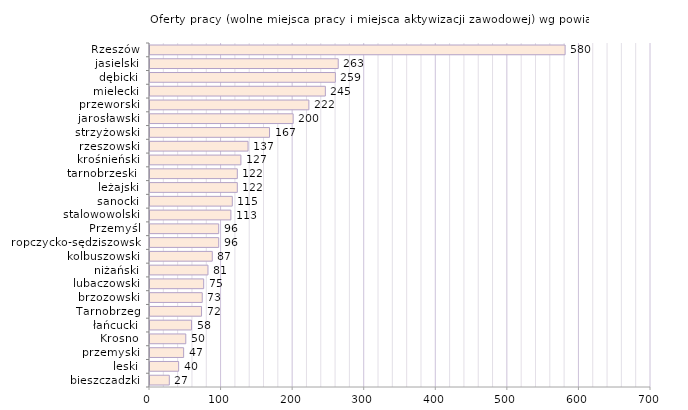
| Category | Oferty pracy (wolne miejsca pracy i miejsca aktywizacji zawodowej) wg powiatów |
|---|---|
| bieszczadzki | 27 |
| leski | 40 |
| przemyski | 47 |
| Krosno | 50 |
| łańcucki | 58 |
| Tarnobrzeg | 72 |
| brzozowski | 73 |
| lubaczowski | 75 |
| niżański | 81 |
| kolbuszowski | 87 |
| ropczycko-sędziszowski | 96 |
| Przemyśl | 96 |
| stalowowolski | 113 |
| sanocki | 115 |
| leżajski | 122 |
| tarnobrzeski  | 122 |
| krośnieński | 127 |
| rzeszowski | 137 |
| strzyżowski | 167 |
| jarosławski | 200 |
| przeworski | 222 |
| mielecki | 245 |
| dębicki | 259 |
| jasielski | 263 |
| Rzeszów | 580 |